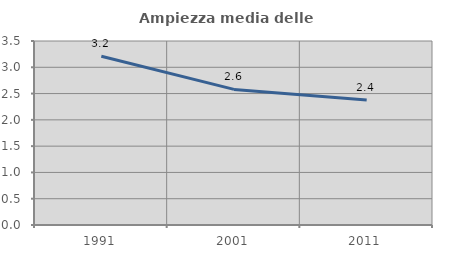
| Category | Ampiezza media delle famiglie |
|---|---|
| 1991.0 | 3.21 |
| 2001.0 | 2.58 |
| 2011.0 | 2.377 |